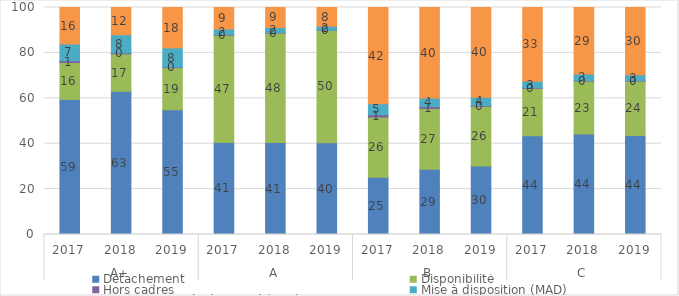
| Category | Détachement | Disponibilité | Hors cadres | Mise à disposition (MAD) | Position normale d’activité (PNA) |
|---|---|---|---|---|---|
| 0 | 59.499 | 16.259 | 0.794 | 7.394 | 16.054 |
| 1 | 63.069 | 16.507 | 0.469 | 7.96 | 11.995 |
| 2 | 54.911 | 18.561 | 0.264 | 8.475 | 17.789 |
| 3 | 40.555 | 47.239 | 0.286 | 2.421 | 9.499 |
| 4 | 40.513 | 48.246 | 0.193 | 2.264 | 8.783 |
| 5 | 40.47 | 49.529 | 0.092 | 1.683 | 8.225 |
| 6 | 25.257 | 26.432 | 1.102 | 4.829 | 42.379 |
| 7 | 28.725 | 26.76 | 0.869 | 3.819 | 39.827 |
| 8 | 30.188 | 26.262 | 0.357 | 3.656 | 39.536 |
| 9 | 43.536 | 20.817 | 0.249 | 2.865 | 32.533 |
| 10 | 44.294 | 23.283 | 0.227 | 2.861 | 29.334 |
| 11 | 43.59 | 24.012 | 0.161 | 2.662 | 29.575 |